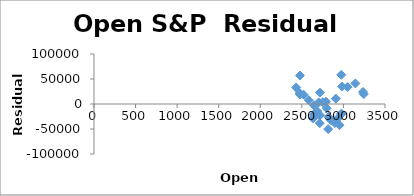
| Category | Series 0 |
|---|---|
| 2431.389893 | 33004.81 |
| 2477.100098 | 19120.256 |
| 2474.419922 | 21890.971 |
| 2521.199951 | 18686.83 |
| 2583.209961 | 7863.269 |
| 2645.100098 | -2532.037 |
| 2683.72998 | -14058.142 |
| 2816.449951 | -50191.274 |
| 2715.219971 | -38402.771 |
| 2633.449951 | -28867.572 |
| 2642.959961 | -21108.497 |
| 2718.699951 | -22319.936 |
| 2704.949951 | -21245.993 |
| 2821.169922 | -25638.074 |
| 2896.959961 | -38063.474 |
| 2926.290039 | -29600.031 |
| 2717.580078 | 22868.213 |
| 2790.5 | 4728.709 |
| 2476.959961 | 56869.207 |
| 2702.320068 | 3268.339 |
| 2798.219971 | -8439.973 |
| 2848.629883 | -32409.93 |
| 2952.330078 | -42380.504 |
| 2751.530029 | 3591.678 |
| 2971.409912 | -19917.715 |
| 2980.320068 | -19664.704 |
| 2909.01001 | 10673.437 |
| 2983.689941 | 34933.086 |
| 3050.719971 | 33889.292 |
| 3143.850098 | 41199.73 |
| 3244.669922 | 19798.917 |
| 3235.659912 | 24075.595 |
| 2974.280029 | 58378.289 |